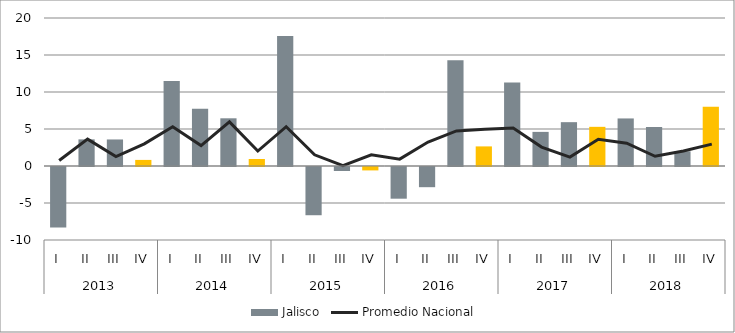
| Category | Jalisco |
|---|---|
| 0 | -8.171 |
| 1 | 3.597 |
| 2 | 3.585 |
| 3 | 0.822 |
| 4 | 11.484 |
| 5 | 7.749 |
| 6 | 6.446 |
| 7 | 0.945 |
| 8 | 17.558 |
| 9 | -6.517 |
| 10 | -0.539 |
| 11 | -0.461 |
| 12 | -4.282 |
| 13 | -2.728 |
| 14 | 14.275 |
| 15 | 2.649 |
| 16 | 11.284 |
| 17 | 4.61 |
| 18 | 5.923 |
| 19 | 5.293 |
| 20 | 6.427 |
| 21 | 5.273 |
| 22 | 1.988 |
| 23 | 7.997 |